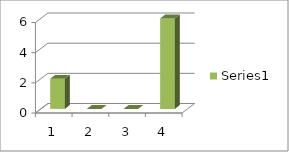
| Category | Series 0 |
|---|---|
| 0 | 2 |
| 1 | 0 |
| 2 | 0 |
| 3 | 6 |